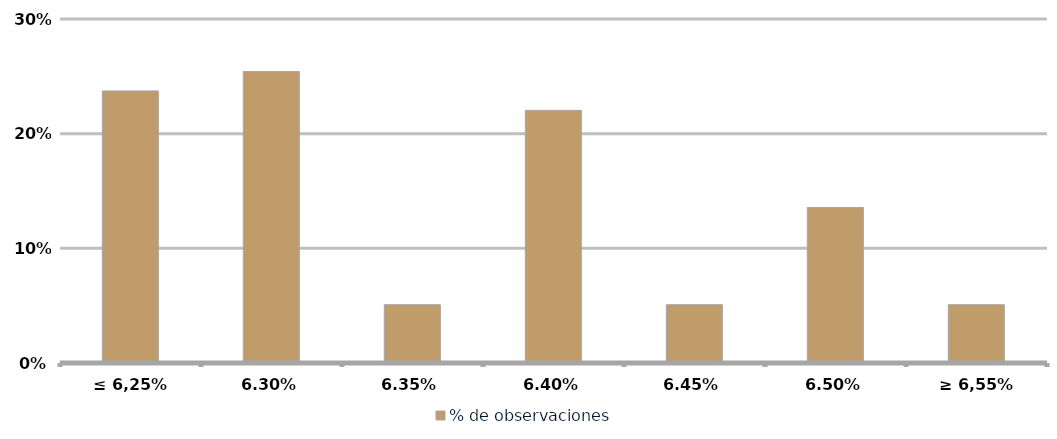
| Category | % de observaciones  |
|---|---|
| ≤ 6,25% | 0.237 |
| 6,30% | 0.254 |
| 6,35% | 0.051 |
| 6,40% | 0.22 |
| 6,45% | 0.051 |
| 6,50% | 0.136 |
| ≥ 6,55% | 0.051 |